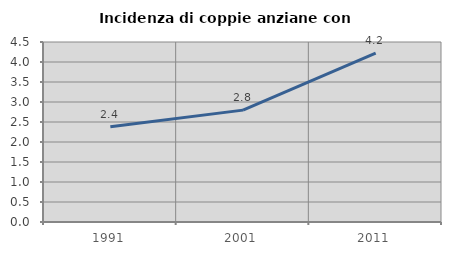
| Category | Incidenza di coppie anziane con figli |
|---|---|
| 1991.0 | 2.382 |
| 2001.0 | 2.797 |
| 2011.0 | 4.222 |